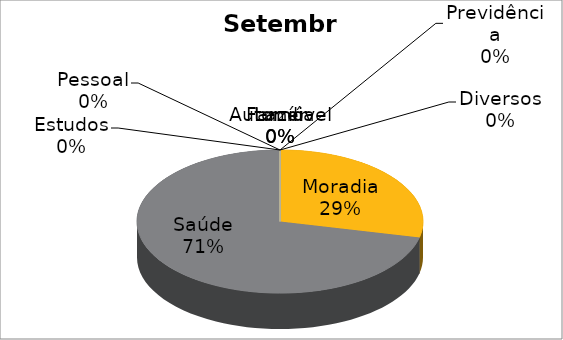
| Category | Setembro | Janeiro |
|---|---|---|
| Moradia | 1200 | 4020 |
| Saúde | 3000 | 100 |
| Estudos | 0 | 680 |
| Automóvel | 0 | 1230 |
| Pessoal | 0 | 640 |
| Lazer | 0 | 400 |
| Família | 0 | 700 |
| Previdência | 0 | 0 |
| Diversos | 0 | 0 |